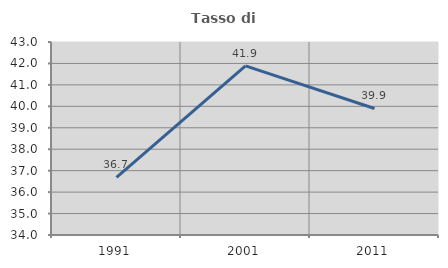
| Category | Tasso di occupazione   |
|---|---|
| 1991.0 | 36.691 |
| 2001.0 | 41.887 |
| 2011.0 | 39.9 |